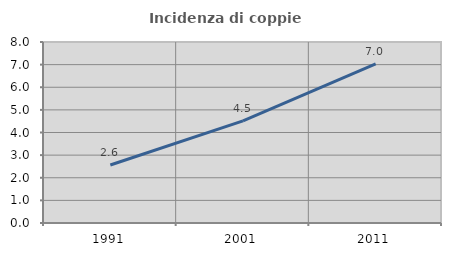
| Category | Incidenza di coppie miste |
|---|---|
| 1991.0 | 2.564 |
| 2001.0 | 4.515 |
| 2011.0 | 7.031 |